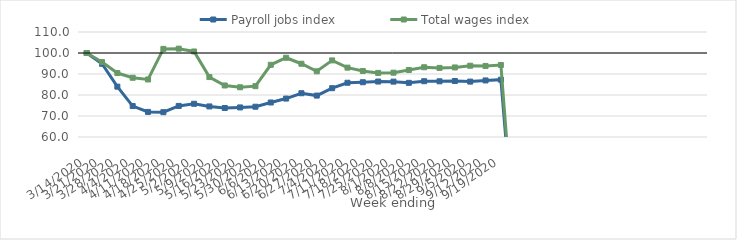
| Category | Payroll jobs index | Total wages index |
|---|---|---|
| 14/03/2020 | 100 | 100 |
| 21/03/2020 | 94.874 | 95.684 |
| 28/03/2020 | 83.975 | 90.451 |
| 04/04/2020 | 74.732 | 88.202 |
| 11/04/2020 | 71.945 | 87.394 |
| 18/04/2020 | 71.819 | 101.964 |
| 25/04/2020 | 74.806 | 102.07 |
| 02/05/2020 | 75.813 | 100.726 |
| 09/05/2020 | 74.554 | 88.537 |
| 16/05/2020 | 73.813 | 84.533 |
| 23/05/2020 | 74.079 | 83.674 |
| 30/05/2020 | 74.416 | 84.21 |
| 06/06/2020 | 76.43 | 94.388 |
| 13/06/2020 | 78.301 | 97.741 |
| 20/06/2020 | 80.841 | 94.882 |
| 27/06/2020 | 79.716 | 91.278 |
| 04/07/2020 | 83.243 | 96.477 |
| 11/07/2020 | 85.83 | 93.031 |
| 18/07/2020 | 86.085 | 91.414 |
| 25/07/2020 | 86.414 | 90.515 |
| 01/08/2020 | 86.364 | 90.631 |
| 08/08/2020 | 85.796 | 91.9 |
| 15/08/2020 | 86.568 | 93.214 |
| 22/08/2020 | 86.52 | 92.903 |
| 29/08/2020 | 86.662 | 93.119 |
| 05/09/2020 | 86.378 | 93.938 |
| 12/09/2020 | 86.929 | 93.834 |
| 19/09/2020 | 87.297 | 94.3 |